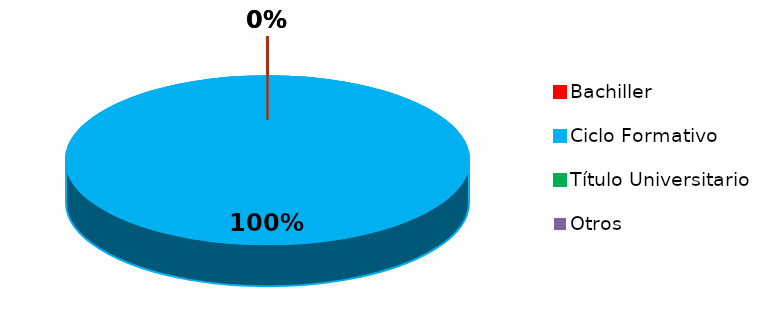
| Category | Series 0 |
|---|---|
| Bachiller | 0 |
| Ciclo Formativo | 5 |
| Título Universitario | 0 |
| Otros | 0 |